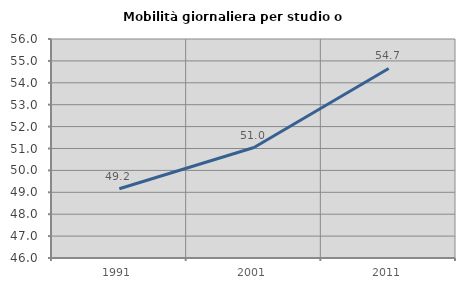
| Category | Mobilità giornaliera per studio o lavoro |
|---|---|
| 1991.0 | 49.161 |
| 2001.0 | 51.044 |
| 2011.0 | 54.655 |